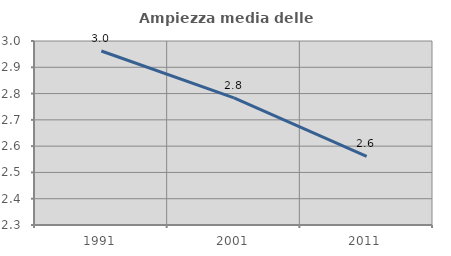
| Category | Ampiezza media delle famiglie |
|---|---|
| 1991.0 | 2.962 |
| 2001.0 | 2.784 |
| 2011.0 | 2.561 |